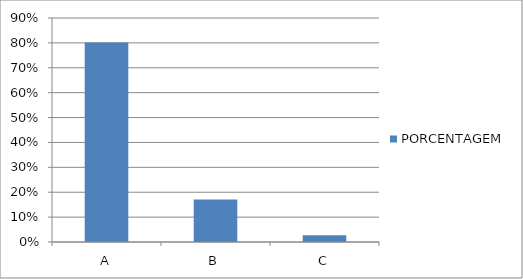
| Category | PORCENTAGEM |
|---|---|
| A | 0.801 |
| B | 0.171 |
| C | 0.027 |